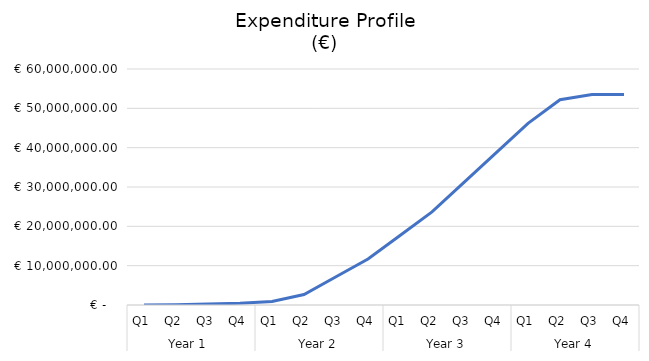
| Category | Cumulative Expenditure 
(€) |
|---|---|
| 0 | 0 |
| 1 | 80000 |
| 2 | 255000 |
| 3 | 430000 |
| 4 | 880000 |
| 5 | 2680000 |
| 6 | 7180000 |
| 7 | 11680000 |
| 8 | 17680000 |
| 9 | 23680000 |
| 10 | 31180000 |
| 11 | 38680000 |
| 12 | 46180000 |
| 13 | 52180000 |
| 14 | 53489938.21 |
| 15 | 53489938.21 |